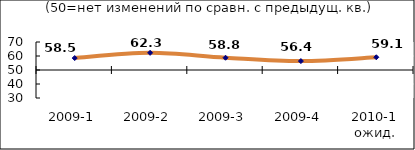
| Category | Диф.индекс ↓ |
|---|---|
| 2009-1 | 58.535 |
| 2009-2 | 62.255 |
| 2009-3 | 58.75 |
| 2009-4 | 56.36 |
| 2010-1 ожид. | 59.095 |